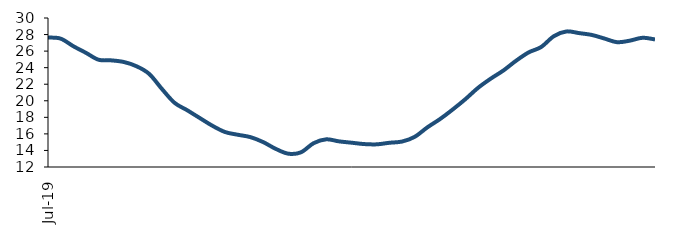
| Category | Series 0 |
|---|---|
| 2019-07-01 | 27.639 |
| 2019-08-01 | 27.508 |
| 2019-09-01 | 26.594 |
| 2019-10-01 | 25.793 |
| 2019-11-01 | 24.956 |
| 2019-12-01 | 24.882 |
| 2020-01-01 | 24.685 |
| 2020-02-01 | 24.173 |
| 2020-03-01 | 23.249 |
| 2020-04-01 | 21.444 |
| 2020-05-01 | 19.761 |
| 2020-06-01 | 18.865 |
| 2020-07-01 | 17.917 |
| 2020-08-01 | 16.982 |
| 2020-09-01 | 16.225 |
| 2020-10-01 | 15.898 |
| 2020-11-01 | 15.612 |
| 2020-12-01 | 15.02 |
| 2021-01-01 | 14.199 |
| 2021-02-01 | 13.61 |
| 2021-03-01 | 13.772 |
| 2021-04-01 | 14.873 |
| 2021-05-01 | 15.345 |
| 2021-06-01 | 15.098 |
| 2021-07-01 | 14.935 |
| 2021-08-01 | 14.77 |
| 2021-09-01 | 14.738 |
| 2021-10-01 | 14.927 |
| 2021-11-01 | 15.076 |
| 2021-12-01 | 15.646 |
| 2022-01-01 | 16.793 |
| 2022-02-01 | 17.792 |
| 2022-03-01 | 18.943 |
| 2022-04-01 | 20.188 |
| 2022-05-01 | 21.554 |
| 2022-06-01 | 22.663 |
| 2022-07-01 | 23.646 |
| 2022-08-01 | 24.822 |
| 2022-09-01 | 25.838 |
| 2022-10-01 | 26.497 |
| 2022-11-01 | 27.799 |
| 2022-12-01 | 28.376 |
| 2023-01-01 | 28.175 |
| 2023-02-01 | 27.955 |
| 2023-03-01 | 27.519 |
| 2023-04-01 | 27.077 |
| 2023-05-01 | 27.26 |
| 2023-06-01 | 27.608 |
| 2023-07-01 | 27.412 |